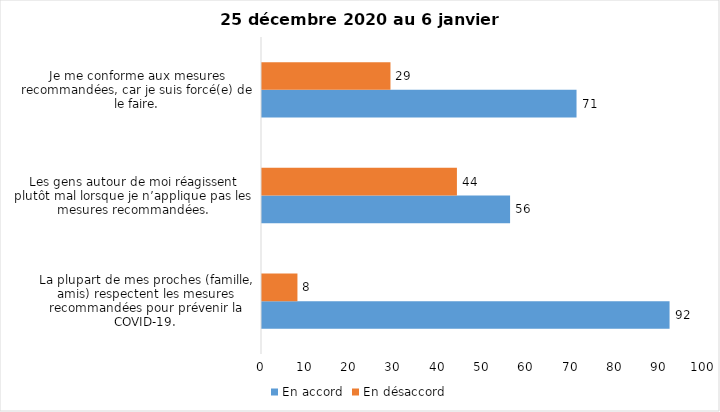
| Category | En accord | En désaccord |
|---|---|---|
| La plupart de mes proches (famille, amis) respectent les mesures recommandées pour prévenir la COVID-19. | 92 | 8 |
| Les gens autour de moi réagissent plutôt mal lorsque je n’applique pas les mesures recommandées. | 56 | 44 |
| Je me conforme aux mesures recommandées, car je suis forcé(e) de le faire. | 71 | 29 |